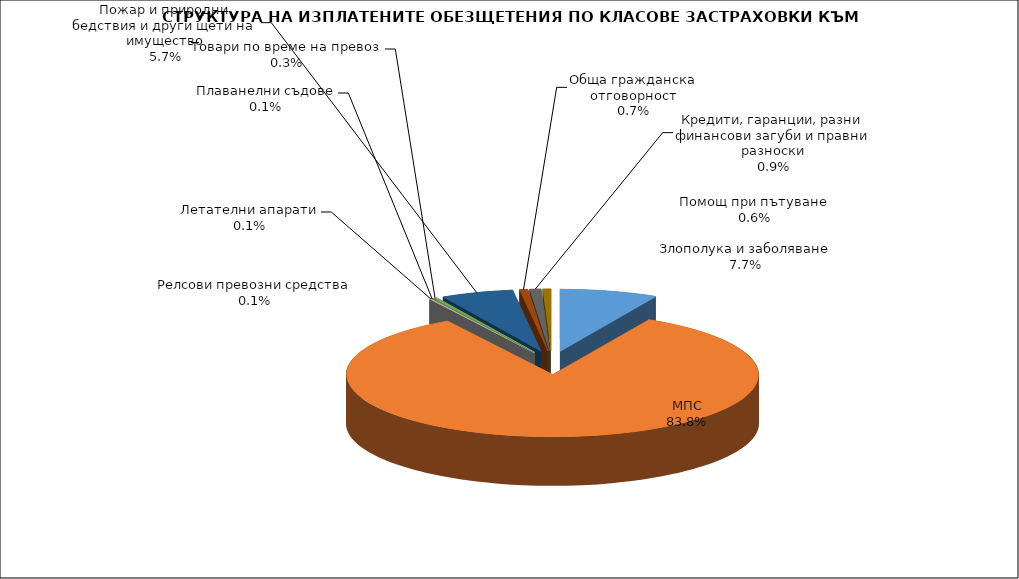
| Category | Злополука и заболяване |
|---|---|
| Злополука и заболяване | 0.077 |
| МПС | 0.838 |
| Релсови превозни средства | 0.001 |
| Летателни апарати | 0.001 |
| Плаванелни съдове | 0.001 |
| Товари по време на превоз | 0.003 |
| Пожар и природни бедствия и други щети на имущество | 0.057 |
| Обща гражданска отговорност | 0.007 |
| Кредити, гаранции, разни финансови загуби и правни разноски | 0.009 |
| Помощ при пътуване | 0.006 |